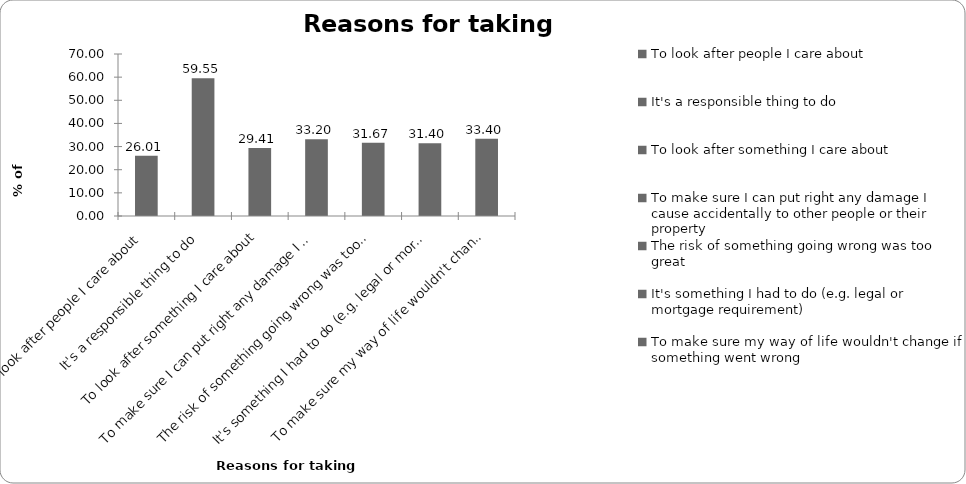
| Category | Reasons for taking insurance |
|---|---|
| To look after people I care about | 26.015 |
| It's a responsible thing to do | 59.548 |
| To look after something I care about | 29.408 |
| To make sure I can put right any damage I cause accidentally to other people or their property | 33.2 |
| The risk of something going wrong was too great | 31.67 |
| It's something I had to do (e.g. legal or mortgage requirement) | 31.404 |
| To make sure my way of life wouldn't change if something went wrong | 33.4 |